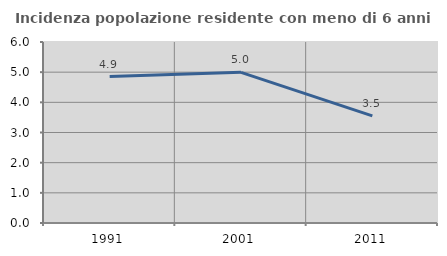
| Category | Incidenza popolazione residente con meno di 6 anni |
|---|---|
| 1991.0 | 4.854 |
| 2001.0 | 4.993 |
| 2011.0 | 3.549 |